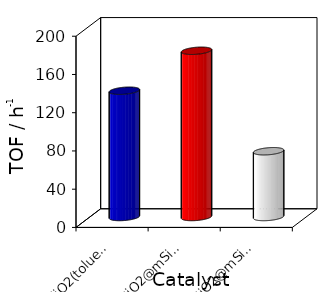
| Category | Series 0 |
|---|---|
| Fe3O4@nSiO2(toluene) | 132.096 |
| Fe3O4@nSiO2@mSiO2(toluene) | 173.893 |
| Fe3O4@nSiO2@mSiO2(HSPG) | 68.786 |